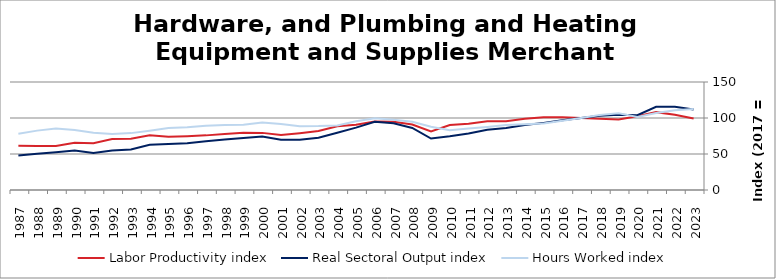
| Category | Labor Productivity index | Real Sectoral Output index | Hours Worked index |
|---|---|---|---|
| 2023.0 | 99.311 | 111.663 | 112.438 |
| 2022.0 | 104.449 | 115.732 | 110.802 |
| 2021.0 | 108.145 | 115.649 | 106.939 |
| 2020.0 | 102.53 | 103.91 | 101.346 |
| 2019.0 | 97.916 | 104.355 | 106.576 |
| 2018.0 | 99.053 | 103.234 | 104.222 |
| 2017.0 | 100 | 100 | 100 |
| 2016.0 | 100.918 | 96.934 | 96.053 |
| 2015.0 | 100.878 | 93.227 | 92.415 |
| 2014.0 | 98.82 | 90.341 | 91.42 |
| 2013.0 | 95.451 | 86.183 | 90.291 |
| 2012.0 | 95.351 | 83.571 | 87.646 |
| 2011.0 | 91.965 | 78.6 | 85.468 |
| 2010.0 | 90.141 | 74.698 | 82.868 |
| 2009.0 | 81.41 | 71.425 | 87.735 |
| 2008.0 | 90.947 | 86.135 | 94.709 |
| 2007.0 | 94.764 | 92.579 | 97.694 |
| 2006.0 | 95.131 | 94.769 | 99.62 |
| 2005.0 | 90.687 | 86.661 | 95.561 |
| 2004.0 | 88.663 | 79.555 | 89.727 |
| 2003.0 | 81.933 | 72.697 | 88.727 |
| 2002.0 | 78.85 | 69.768 | 88.482 |
| 2001.0 | 76.24 | 69.761 | 91.501 |
| 2000.0 | 79.336 | 74.276 | 93.622 |
| 1999.0 | 79.61 | 72.241 | 90.744 |
| 1998.0 | 77.839 | 70.216 | 90.207 |
| 1997.0 | 75.87 | 67.694 | 89.224 |
| 1996.0 | 74.773 | 65.095 | 87.057 |
| 1995.0 | 73.957 | 63.793 | 86.257 |
| 1994.0 | 76.133 | 62.753 | 82.425 |
| 1993.0 | 71.268 | 56.305 | 79.004 |
| 1992.0 | 70.717 | 54.964 | 77.724 |
| 1991.0 | 64.828 | 51.471 | 79.396 |
| 1990.0 | 65.663 | 54.707 | 83.315 |
| 1989.0 | 61.181 | 52.27 | 85.436 |
| 1988.0 | 61.079 | 50.369 | 82.466 |
| 1987.0 | 61.445 | 48.001 | 78.12 |